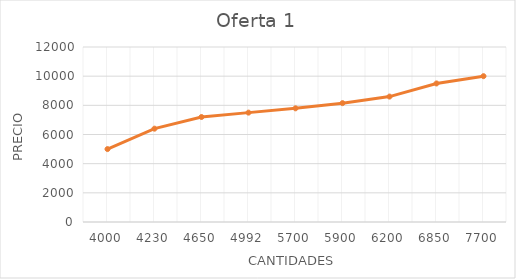
| Category | Precio 1 |
|---|---|
| 4000.0 | 5000 |
| 4230.0 | 6400 |
| 4650.0 | 7200 |
| 4992.0 | 7500 |
| 5700.0 | 7795 |
| 5900.0 | 8150 |
| 6200.0 | 8600 |
| 6850.0 | 9500 |
| 7700.0 | 10000 |